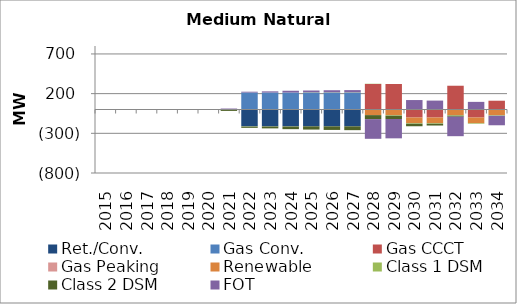
| Category | Ret./Conv. | Gas Conv. | Gas CCCT | Gas Peaking | Renewable | Class 1 DSM | Class 2 DSM | FOT |
|---|---|---|---|---|---|---|---|---|
| 2015.0 | 0 | 0 | 0 | 0 | 0 | 0 | -0.51 | 0.387 |
| 2016.0 | 0 | 0 | 0 | 0 | 0 | 0 | -1.02 | 0.722 |
| 2017.0 | 0 | 0 | 0 | 0 | 0 | 0 | -1.28 | 0.878 |
| 2018.0 | 0 | 0 | 0 | 0 | 0 | 0 | -1.91 | 1.137 |
| 2019.0 | 0 | 0 | 0 | 0 | 0 | 0 | -4.16 | 0.524 |
| 2020.0 | 0 | 0 | 0 | 0 | 0 | 0 | -6.35 | 1.614 |
| 2021.0 | 0 | 0 | 0 | 0 | 0 | -7.45 | -11.55 | 12.135 |
| 2022.0 | -212 | 214 | 0 | 0 | 0 | -3.72 | -15.45 | 10.09 |
| 2023.0 | -212 | 214 | 0 | 0 | 0 | -2.1 | -23.74 | 14.635 |
| 2024.0 | -212 | 214 | 0 | 0 | 0 | -2.43 | -33.23 | 22.187 |
| 2025.0 | -212 | 214 | 0 | 0 | 0 | 3.17 | -40.86 | 22.211 |
| 2026.0 | -212 | 214 | 0 | 0 | 0 | 3.1 | -45.38 | 25.637 |
| 2027.0 | -212 | 214 | 0 | 0 | 0 | 3.1 | -48.2 | 27.215 |
| 2028.0 | 0 | 0 | 321.6 | 0 | -71 | 3.1 | -50.27 | -247.949 |
| 2029.0 | 0 | 0 | 321.6 | 0 | -71 | -7.45 | -41.14 | -243.688 |
| 2030.0 | 0 | 0 | -101.4 | 0 | -71 | -7.45 | -31.23 | 119.051 |
| 2031.0 | 0 | 0 | -101.4 | 0 | -71 | -7.45 | -22.11 | 112.288 |
| 2032.0 | 0 | 0 | 299.383 | 0 | -71 | -7.45 | -12.5 | -245.254 |
| 2033.0 | 0 | 0 | -101.4 | 0 | -71 | -7.45 | -0.12 | 96.165 |
| 2034.0 | 0 | 0 | 110.6 | 0 | -71 | -7.45 | -0.01 | -120.185 |